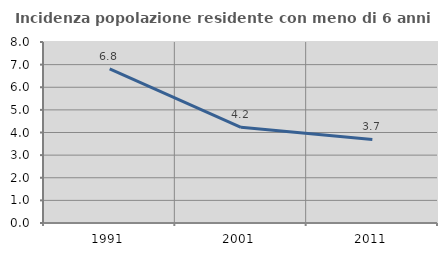
| Category | Incidenza popolazione residente con meno di 6 anni |
|---|---|
| 1991.0 | 6.815 |
| 2001.0 | 4.228 |
| 2011.0 | 3.693 |